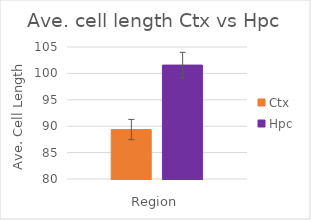
| Category | Ctx | Hpc |
|---|---|---|
| Total cells | 89.365 | 101.574 |